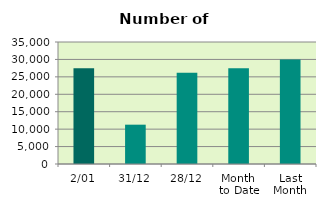
| Category | Series 0 |
|---|---|
| 2/01 | 27494 |
| 31/12 | 11280 |
| 28/12 | 26174 |
| Month 
to Date | 27494 |
| Last
Month | 29998.632 |